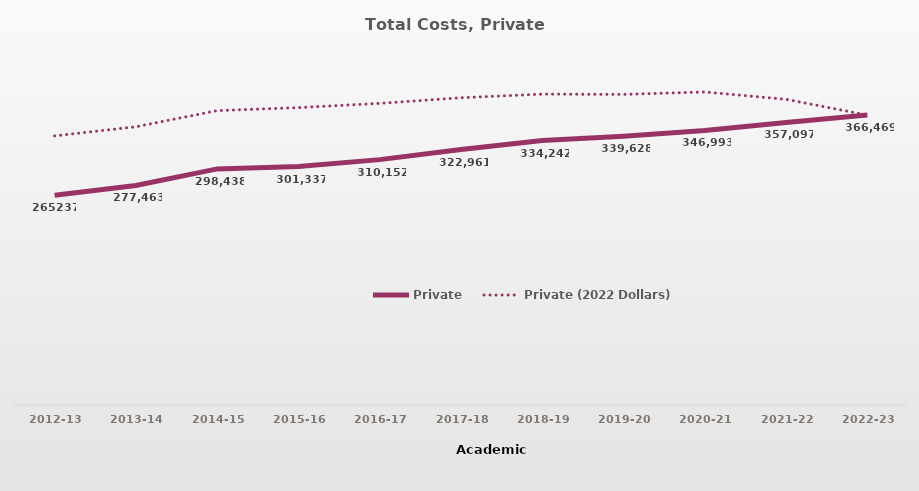
| Category | Private | Private (2022 Dollars) |
|---|---|---|
| 2012-13 | 265237 | 340201.25 |
| 2013-14 | 277463 | 351708.314 |
| 2014-15 | 298438 | 372129.215 |
| 2015-16 | 301337.21 | 375886.936 |
| 2016-17 | 310151.65 | 381296.408 |
| 2017-18 | 322960.58 | 388368.631 |
| 2018-19 | 334242.27 | 392989.849 |
| 2019-20 | 339627.93 | 392600.1 |
| 2020-21 | 346992.56 | 395692.876 |
| 2021-22 | 357097.19 | 386381.632 |
| 2022-23 | 366468.93 | 366468.93 |